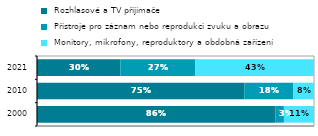
| Category |  Rozhlasové a TV přijímače |  Přístroje pro záznam nebo reprodukci zvuku a obrazu |  Monitory, mikrofony, reproduktory a obdobná zařízení |
|---|---|---|---|
| 2000.0 | 0.86 | 0.031 | 0.109 |
| 2010.0 | 0.748 | 0.176 | 0.076 |
| 2021.0 | 0.301 | 0.27 | 0.429 |